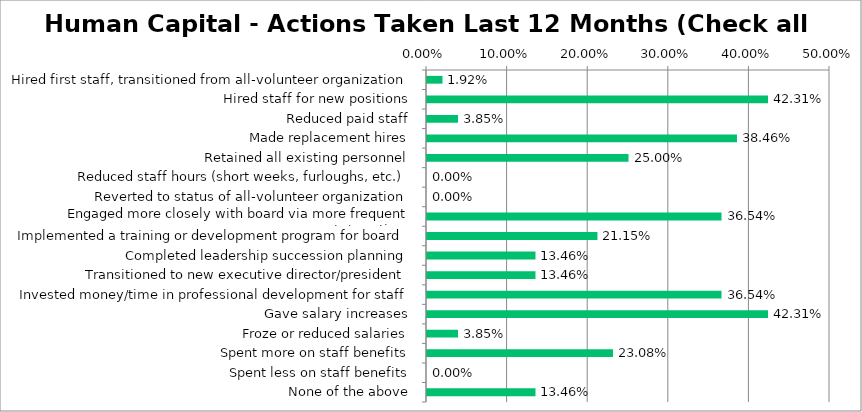
| Category | Responses |
|---|---|
| Hired first staff, transitioned from all-volunteer organization | 0.019 |
| Hired staff for new positions | 0.423 |
| Reduced paid staff | 0.038 |
| Made replacement hires | 0.385 |
| Retained all existing personnel | 0.25 |
| Reduced staff hours (short weeks, furloughs, etc.) | 0 |
| Reverted to status of all-volunteer organization | 0 |
| Engaged more closely with board via more frequent reports/meetings | 0.365 |
| Implemented a training or development program for board | 0.212 |
| Completed leadership succession planning | 0.135 |
| Transitioned to new executive director/president | 0.135 |
| Invested money/time in professional development for staff | 0.365 |
| Gave salary increases | 0.423 |
| Froze or reduced salaries | 0.038 |
| Spent more on staff benefits | 0.231 |
| Spent less on staff benefits | 0 |
| None of the above | 0.135 |